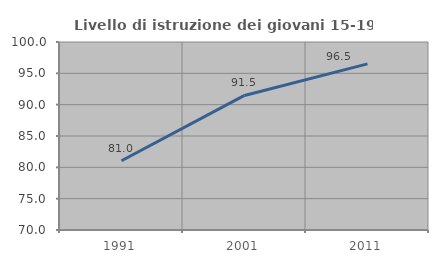
| Category | Livello di istruzione dei giovani 15-19 anni |
|---|---|
| 1991.0 | 81.05 |
| 2001.0 | 91.474 |
| 2011.0 | 96.514 |